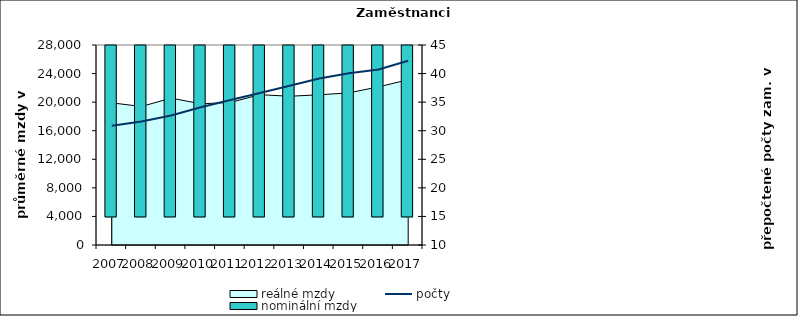
| Category | nominální mzdy  |
|---|---|
| 2007.0 | 16973 |
| 2008.0 | 17588.857 |
| 2009.0 | 18856.605 |
| 2010.0 | 18386.08 |
| 2011.0 | 18918.549 |
| 2012.0 | 20603.759 |
| 2013.0 | 20678.761 |
| 2014.0 | 20966.004 |
| 2015.0 | 21297.714 |
| 2016.0 | 22300.279 |
| 2017.0 | 23843.36 |